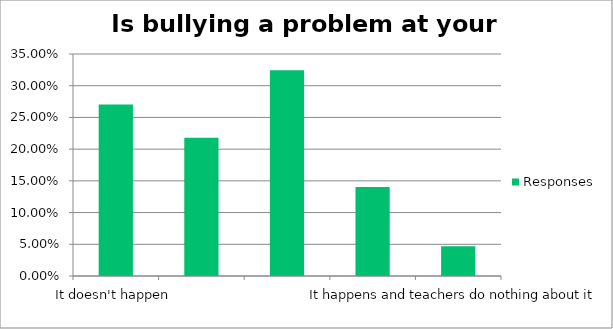
| Category | Responses |
|---|---|
| It doesn't happen | 0.27 |
| It happens and teachers are really good at resolving it | 0.218 |
| It happens and teachers are good at resolving it | 0.324 |
| It happens and teachers are not good at resolving it | 0.14 |
| It happens and teachers do nothing about it | 0.047 |